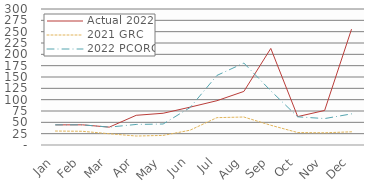
| Category | Actual 2022 | 2021 GRC | 2022 PCORC |
|---|---|---|---|
| Jan | 44.378 | 30.785 | 44.378 |
| Feb | 44.501 | 30.266 | 44.501 |
| Mar | 39.419 | 24.826 | 39.419 |
| Apr | 65.502 | 19.825 | 45.347 |
| May | 70.024 | 21.151 | 46.292 |
| Jun | 83.414 | 32.648 | 82.546 |
| Jul | 97.732 | 60.357 | 153.451 |
| Aug | 118.176 | 61.707 | 180.749 |
| Sep | 213.038 | 43.578 | 119.51 |
| Oct | 62.688 | 27.427 | 62.152 |
| Nov | 76.181 | 26.937 | 58.294 |
| Dec | 255.533 | 29.112 | 68.647 |